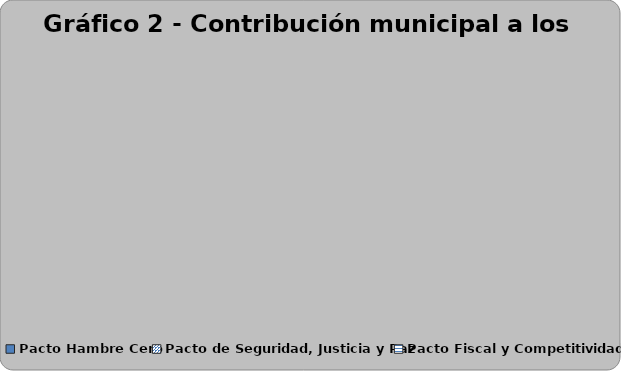
| Category | Series 0 |
|---|---|
| Pacto Hambre Cero | 0 |
| Pacto de Seguridad, Justicia y Paz | 0 |
| Pacto Fiscal y Competitividad | 0 |